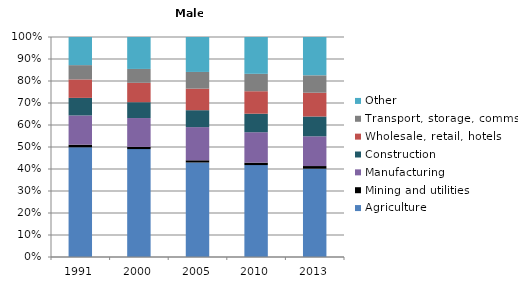
| Category | Agriculture | Mining and utilities | Manufacturing | Construction | Wholesale, retail, hotels | Transport, storage, comms | Other |
|---|---|---|---|---|---|---|---|
| 1991.0 | 49.9 | 1.2 | 13.3 | 8 | 8.4 | 6.5 | 12.8 |
| 2000.0 | 49 | 1 | 13.1 | 7.2 | 8.8 | 6.3 | 14.5 |
| 2005.0 | 43 | 1 | 15.1 | 7.7 | 9.8 | 7.6 | 15.9 |
| 2010.0 | 41.7 | 1.1 | 13.8 | 8.4 | 10.2 | 7.9 | 16.7 |
| 2013.0 | 40.1 | 1.2 | 13.5 | 9 | 10.8 | 7.9 | 17.4 |